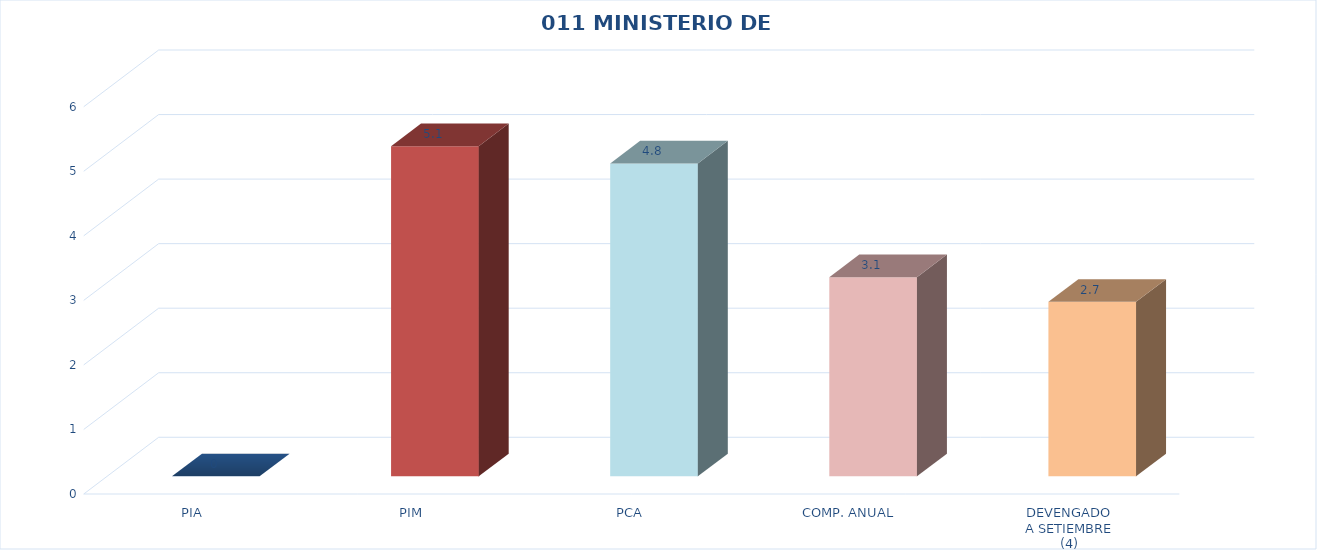
| Category | 011 MINISTERIO DE SALUD |
|---|---|
| PIA | 0 |
| PIM | 5.115 |
| PCA | 4.848 |
| COMP. ANUAL | 3.085 |
| DEVENGADO
A SETIEMBRE
(4) | 2.704 |